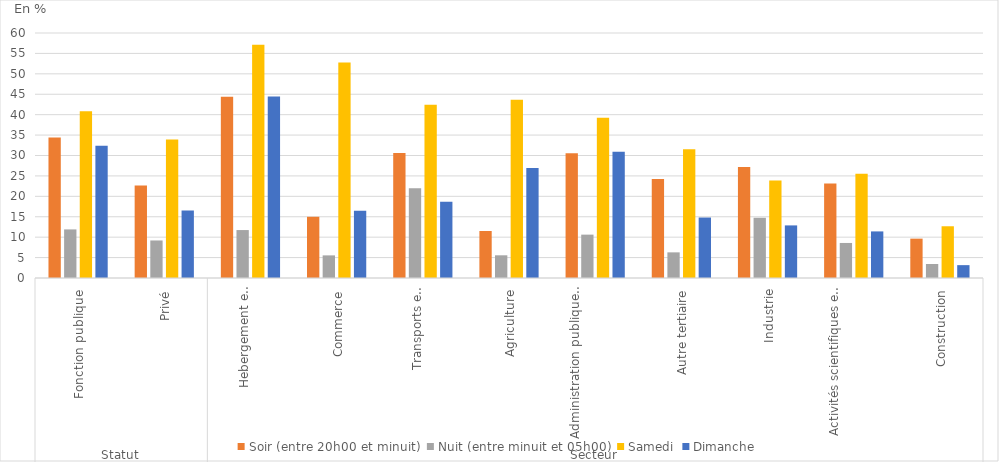
| Category | Soir (entre 20h00 et minuit) | Nuit (entre minuit et 05h00) | Samedi | Dimanche |
|---|---|---|---|---|
| 0 | 34.41 | 11.9 | 40.85 | 32.4 |
| 1 | 22.64 | 9.19 | 33.91 | 16.56 |
| 2 | 44.41 | 11.74 | 57.15 | 44.42 |
| 3 | 14.99 | 5.54 | 52.77 | 16.48 |
| 4 | 30.64 | 21.98 | 42.43 | 18.69 |
| 5 | 11.51 | 5.56 | 43.67 | 26.93 |
| 6 | 30.54 | 10.62 | 39.22 | 30.9 |
| 7 | 24.26 | 6.28 | 31.54 | 14.81 |
| 8 | 27.21 | 14.75 | 23.89 | 12.88 |
| 9 | 23.17 | 8.58 | 25.51 | 11.41 |
| 10 | 9.64 | 3.43 | 12.67 | 3.15 |